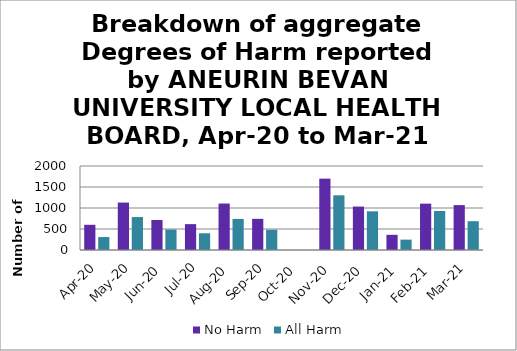
| Category | No Harm | All Harm |
|---|---|---|
| Apr-20 | 600 | 308 |
| May-20 | 1129 | 784 |
| Jun-20 | 715 | 487 |
| Jul-20 | 616 | 398 |
| Aug-20 | 1106 | 740 |
| Sep-20 | 742 | 482 |
| Oct-20 | 0 | 0 |
| Nov-20 | 1699 | 1302 |
| Dec-20 | 1034 | 921 |
| Jan-21 | 361 | 247 |
| Feb-21 | 1104 | 929 |
| Mar-21 | 1069 | 686 |